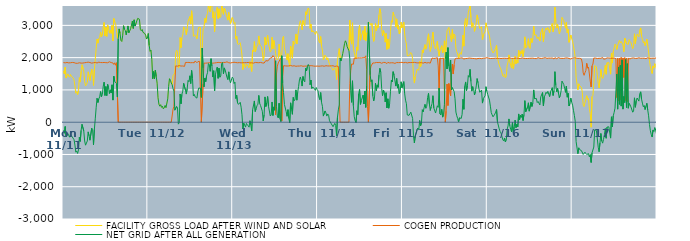
| Category | FACILITY GROSS LOAD AFTER WIND AND SOLAR | COGEN PRODUCTION | NET GRID AFTER ALL GENERATION |
|---|---|---|---|
|  Mon  11/11 | 1593 | 1847 | -254 |
|  Mon  11/11 | 1495 | 1838 | -343 |
|  Mon  11/11 | 1705 | 1839 | -134 |
|  Mon  11/11 | 1369 | 1828 | -459 |
|  Mon  11/11 | 1440 | 1850 | -410 |
|  Mon  11/11 | 1496 | 1850 | -354 |
|  Mon  11/11 | 1423 | 1838 | -415 |
|  Mon  11/11 | 1392 | 1857 | -465 |
|  Mon  11/11 | 1478 | 1842 | -364 |
|  Mon  11/11 | 1421 | 1844 | -423 |
|  Mon  11/11 | 1393 | 1851 | -458 |
|  Mon  11/11 | 1372 | 1834 | -462 |
|  Mon  11/11 | 1301 | 1845 | -544 |
|  Mon  11/11 | 1128 | 1837 | -709 |
|  Mon  11/11 | 897 | 1826 | -929 |
|  Mon  11/11 | 948 | 1839 | -891 |
|  Mon  11/11 | 856 | 1825 | -969 |
|  Mon  11/11 | 979 | 1838 | -859 |
|  Mon  11/11 | 1381 | 1841 | -460 |
|  Mon  11/11 | 1243 | 1839 | -596 |
|  Mon  11/11 | 1578 | 1830 | -252 |
|  Mon  11/11 | 1780 | 1845 | -65 |
|  Mon  11/11 | 1782 | 1832 | -50 |
|  Mon  11/11 | 1585 | 1858 | -273 |
|  Mon  11/11 | 1260 | 1843 | -583 |
|  Mon  11/11 | 1125 | 1838 | -713 |
|  Mon  11/11 | 1161 | 1850 | -689 |
|  Mon  11/11 | 1241 | 1824 | -583 |
|  Mon  11/11 | 1560 | 1860 | -300 |
|  Mon  11/11 | 1417 | 1842 | -425 |
|  Mon  11/11 | 1290 | 1848 | -558 |
|  Mon  11/11 | 1295 | 1827 | -532 |
|  Mon  11/11 | 1643 | 1829 | -186 |
|  Mon  11/11 | 1608 | 1841 | -233 |
|  Mon  11/11 | 1139 | 1842 | -703 |
|  Mon  11/11 | 1617 | 1836 | -219 |
|  Mon  11/11 | 1953 | 1850 | 103 |
|  Mon  11/11 | 2284 | 1838 | 446 |
|  Mon  11/11 | 2576 | 1835 | 741 |
|  Mon  11/11 | 2449 | 1839 | 610 |
|  Mon  11/11 | 2586 | 1859 | 727 |
|  Mon  11/11 | 2620 | 1836 | 784 |
|  Mon  11/11 | 2797 | 1848 | 949 |
|  Mon  11/11 | 2644 | 1857 | 787 |
|  Mon  11/11 | 2698 | 1846 | 852 |
|  Mon  11/11 | 2960 | 1848 | 1112 |
|  Mon  11/11 | 3089 | 1850 | 1239 |
|  Mon  11/11 | 2671 | 1844 | 827 |
|  Mon  11/11 | 2949 | 1844 | 1105 |
|  Mon  11/11 | 2656 | 1833 | 823 |
|  Mon  11/11 | 3014 | 1842 | 1172 |
|  Mon  11/11 | 2923 | 1855 | 1068 |
|  Mon  11/11 | 2759 | 1871 | 888 |
|  Mon  11/11 | 2853 | 1849 | 1004 |
|  Mon  11/11 | 2750 | 1847 | 903 |
|  Mon  11/11 | 2998 | 1839 | 1159 |
|  Mon  11/11 | 2519 | 1835 | 684 |
|  Mon  11/11 | 3213 | 1789 | 1424 |
|  Mon  11/11 | 3104 | 1841 | 1263 |
|  Mon  11/11 | 3055 | 1765 | 1290 |
|  Mon  11/11 | 3043 | 1843 | 1200 |
|  Mon  11/11 | 2598 | 1819 | 779 |
|  Mon  11/11 | 2587 | 0 | 2587 |
|  Mon  11/11 | 2890 | 0 | 2890 |
|  Mon  11/11 | 2752 | 0 | 2752 |
|  Mon  11/11 | 2536 | 0 | 2536 |
|  Mon  11/11 | 2501 | 0 | 2501 |
|  Mon  11/11 | 2674 | 0 | 2674 |
|  Mon  11/11 | 2988 | 0 | 2988 |
|  Mon  11/11 | 2880 | 0 | 2880 |
|  Mon  11/11 | 2840 | 0 | 2840 |
|  Mon  11/11 | 2708 | 0 | 2708 |
|  Mon  11/11 | 2832 | 0 | 2832 |
|  Mon  11/11 | 2982 | 0 | 2982 |
|  Mon  11/11 | 2768 | 0 | 2768 |
|  Mon  11/11 | 2793 | 0 | 2793 |
|  Mon  11/11 | 2895 | 0 | 2895 |
|  Mon  11/11 | 2891 | 0 | 2891 |
|  Mon  11/11 | 3133 | 0 | 3133 |
|  Mon  11/11 | 2905 | 0 | 2905 |
|  Mon  11/11 | 3172 | 0 | 3172 |
|  Mon  11/11 | 2978 | 0 | 2978 |
|  Mon  11/11 | 3051 | 0 | 3051 |
|  Mon  11/11 | 3139 | 0 | 3139 |
|  Mon  11/11 | 3216 | 0 | 3216 |
|  Mon  11/11 | 3207 | 0 | 3207 |
|  Mon  11/11 | 3188 | 0 | 3188 |
|  Mon  11/11 | 2874 | 0 | 2874 |
|  Mon  11/11 | 2835 | 0 | 2835 |
|  Mon  11/11 | 2871 | 0 | 2871 |
|  Mon  11/11 | 2784 | 0 | 2784 |
|  Mon  11/11 | 2808 | 0 | 2808 |
|  Mon  11/11 | 2749 | 0 | 2749 |
|  Mon  11/11 | 2696 | 0 | 2696 |
|  Mon  11/11 | 2576 | 0 | 2576 |
|  Mon  11/11 | 2610 | 0 | 2610 |
|  Tue  11/12 | 2747 | 0 | 2747 |
|  Tue  11/12 | 2378 | 0 | 2378 |
|  Tue  11/12 | 2195 | 0 | 2195 |
|  Tue  11/12 | 2233 | 0 | 2233 |
|  Tue  11/12 | 1935 | 0 | 1935 |
|  Tue  11/12 | 1345 | 0 | 1345 |
|  Tue  11/12 | 1569 | 0 | 1569 |
|  Tue  11/12 | 1343 | 0 | 1343 |
|  Tue  11/12 | 1611 | 0 | 1611 |
|  Tue  11/12 | 1409 | 0 | 1409 |
|  Tue  11/12 | 1208 | 0 | 1208 |
|  Tue  11/12 | 758 | 0 | 758 |
|  Tue  11/12 | 558 | 0 | 558 |
|  Tue  11/12 | 496 | 0 | 496 |
|  Tue  11/12 | 542 | 0 | 542 |
|  Tue  11/12 | 460 | 0 | 460 |
|  Tue  11/12 | 493 | 0 | 493 |
|  Tue  11/12 | 413 | 0 | 413 |
|  Tue  11/12 | 444 | 0 | 444 |
|  Tue  11/12 | 518 | 0 | 518 |
|  Tue  11/12 | 450 | 0 | 450 |
|  Tue  11/12 | 422 | 0 | 422 |
|  Tue  11/12 | 722 | 0 | 722 |
|  Tue  11/12 | 1112 | 0 | 1112 |
|  Tue  11/12 | 1348 | 0 | 1348 |
|  Tue  11/12 | 1299 | 0 | 1299 |
|  Tue  11/12 | 1214 | 0 | 1214 |
|  Tue  11/12 | 1162 | 0 | 1162 |
|  Tue  11/12 | 1440 | 404 | 1036 |
|  Tue  11/12 | 1455 | 490 | 965 |
|  Tue  11/12 | 1524 | 1152 | 372 |
|  Tue  11/12 | 2144 | 1744 | 400 |
|  Tue  11/12 | 2232 | 1747 | 485 |
|  Tue  11/12 | 2190 | 1736 | 454 |
|  Tue  11/12 | 1677 | 1738 | -61 |
|  Tue  11/12 | 1737 | 1753 | -16 |
|  Tue  11/12 | 2622 | 1749 | 873 |
|  Tue  11/12 | 2309 | 1739 | 570 |
|  Tue  11/12 | 2609 | 1747 | 862 |
|  Tue  11/12 | 2702 | 1741 | 961 |
|  Tue  11/12 | 2955 | 1750 | 1205 |
|  Tue  11/12 | 2919 | 1730 | 1189 |
|  Tue  11/12 | 2846 | 1851 | 995 |
|  Tue  11/12 | 2706 | 1835 | 871 |
|  Tue  11/12 | 2895 | 1851 | 1044 |
|  Tue  11/12 | 3129 | 1835 | 1294 |
|  Tue  11/12 | 3102 | 1851 | 1251 |
|  Tue  11/12 | 3273 | 1836 | 1437 |
|  Tue  11/12 | 3040 | 1842 | 1198 |
|  Tue  11/12 | 3452 | 1850 | 1602 |
|  Tue  11/12 | 3202 | 1845 | 1357 |
|  Tue  11/12 | 2659 | 1845 | 814 |
|  Tue  11/12 | 2704 | 1843 | 861 |
|  Tue  11/12 | 2683 | 1897 | 786 |
|  Tue  11/12 | 2657 | 1890 | 767 |
|  Tue  11/12 | 2587 | 1842 | 745 |
|  Tue  11/12 | 2813 | 1875 | 938 |
|  Tue  11/12 | 2941 | 1885 | 1056 |
|  Tue  11/12 | 2941 | 1885 | 1056 |
|  Tue  11/12 | 2941 | 1885 | 1056 |
|  Tue  11/12 | 766 | 0 | 766 |
|  Tue  11/12 | 2298 | 0 | 2298 |
|  Tue  11/12 | 2877 | 1194 | 1683 |
|  Tue  11/12 | 2923 | 1829 | 1094 |
|  Tue  11/12 | 3219 | 1855 | 1364 |
|  Tue  11/12 | 3087 | 1829 | 1258 |
|  Tue  11/12 | 3298 | 1847 | 1451 |
|  Tue  11/12 | 3370 | 1835 | 1535 |
|  Tue  11/12 | 3640 | 1823 | 1817 |
|  Tue  11/12 | 3627 | 1842 | 1785 |
|  Tue  11/12 | 3416 | 1839 | 1577 |
|  Tue  11/12 | 3810 | 1843 | 1967 |
|  Tue  11/12 | 3594 | 1857 | 1737 |
|  Tue  11/12 | 3227 | 1828 | 1399 |
|  Tue  11/12 | 3421 | 1826 | 1595 |
|  Tue  11/12 | 2807 | 1835 | 972 |
|  Tue  11/12 | 3324 | 1843 | 1481 |
|  Tue  11/12 | 3464 | 1843 | 1621 |
|  Tue  11/12 | 3561 | 1857 | 1704 |
|  Tue  11/12 | 3210 | 1852 | 1358 |
|  Tue  11/12 | 3515 | 1841 | 1674 |
|  Tue  11/12 | 3240 | 1847 | 1393 |
|  Tue  11/12 | 3271 | 1832 | 1439 |
|  Tue  11/12 | 3661 | 1846 | 1815 |
|  Tue  11/12 | 3679 | 1832 | 1847 |
|  Tue  11/12 | 3344 | 1851 | 1493 |
|  Tue  11/12 | 3537 | 1854 | 1683 |
|  Tue  11/12 | 3466 | 1851 | 1615 |
|  Tue  11/12 | 3495 | 1852 | 1643 |
|  Tue  11/12 | 3260 | 1870 | 1390 |
|  Tue  11/12 | 3162 | 1841 | 1321 |
|  Tue  11/12 | 3402 | 1843 | 1559 |
|  Tue  11/12 | 3175 | 1858 | 1317 |
|  Tue  11/12 | 3054 | 1834 | 1220 |
|  Tue  11/12 | 3061 | 1842 | 1219 |
|  Tue  11/12 | 3244 | 1848 | 1396 |
|  Wed  11/13 | 3191 | 1832 | 1359 |
|  Wed  11/13 | 3055 | 1858 | 1197 |
|  Wed  11/13 | 3090 | 1849 | 1241 |
|  Wed  11/13 | 2581 | 1848 | 733 |
|  Wed  11/13 | 2663 | 1830 | 833 |
|  Wed  11/13 | 2436 | 1841 | 595 |
|  Wed  11/13 | 2401 | 1849 | 552 |
|  Wed  11/13 | 2385 | 1846 | 539 |
|  Wed  11/13 | 2462 | 1846 | 616 |
|  Wed  11/13 | 2304 | 1839 | 465 |
|  Wed  11/13 | 2074 | 1845 | 229 |
|  Wed  11/13 | 1632 | 1843 | -211 |
|  Wed  11/13 | 1815 | 1842 | -27 |
|  Wed  11/13 | 1801 | 1844 | -43 |
|  Wed  11/13 | 1693 | 1846 | -153 |
|  Wed  11/13 | 1805 | 1844 | -39 |
|  Wed  11/13 | 1770 | 1847 | -77 |
|  Wed  11/13 | 1738 | 1852 | -114 |
|  Wed  11/13 | 1687 | 1842 | -155 |
|  Wed  11/13 | 1881 | 1836 | 45 |
|  Wed  11/13 | 1741 | 1827 | -86 |
|  Wed  11/13 | 1569 | 1840 | -271 |
|  Wed  11/13 | 2228 | 1846 | 382 |
|  Wed  11/13 | 2191 | 1829 | 362 |
|  Wed  11/13 | 2496 | 1838 | 658 |
|  Wed  11/13 | 2182 | 1851 | 331 |
|  Wed  11/13 | 2267 | 1843 | 424 |
|  Wed  11/13 | 2357 | 1845 | 512 |
|  Wed  11/13 | 2418 | 1860 | 558 |
|  Wed  11/13 | 2672 | 1843 | 829 |
|  Wed  11/13 | 2419 | 1841 | 578 |
|  Wed  11/13 | 2368 | 1851 | 517 |
|  Wed  11/13 | 2337 | 1846 | 491 |
|  Wed  11/13 | 2176 | 1837 | 339 |
|  Wed  11/13 | 1898 | 1859 | 39 |
|  Wed  11/13 | 2060 | 1831 | 229 |
|  Wed  11/13 | 2632 | 1849 | 783 |
|  Wed  11/13 | 2392 | 1908 | 484 |
|  Wed  11/13 | 2499 | 1894 | 605 |
|  Wed  11/13 | 2690 | 1894 | 796 |
|  Wed  11/13 | 2422 | 1931 | 491 |
|  Wed  11/13 | 2449 | 1945 | 504 |
|  Wed  11/13 | 2173 | 1982 | 191 |
|  Wed  11/13 | 2221 | 1994 | 227 |
|  Wed  11/13 | 2632 | 2006 | 626 |
|  Wed  11/13 | 2270 | 2062 | 208 |
|  Wed  11/13 | 2533 | 2059 | 474 |
|  Wed  11/13 | 2371 | 2001 | 370 |
|  Wed  11/13 | 2131 | 230 | 1901 |
|  Wed  11/13 | 1977 | 1492 | 485 |
|  Wed  11/13 | 1929 | 1735 | 194 |
|  Wed  11/13 | 1970 | 1836 | 134 |
|  Wed  11/13 | 2415 | 1828 | 587 |
|  Wed  11/13 | 2047 | 1939 | 108 |
|  Wed  11/13 | 2004 | 1985 | 19 |
|  Wed  11/13 | 2093 | 35 | 2058 |
|  Wed  11/13 | 2607 | 1397 | 1210 |
|  Wed  11/13 | 2664 | 1750 | 914 |
|  Wed  11/13 | 2306 | 1759 | 547 |
|  Wed  11/13 | 2308 | 1745 | 563 |
|  Wed  11/13 | 2070 | 1745 | 325 |
|  Wed  11/13 | 1923 | 1740 | 183 |
|  Wed  11/13 | 2122 | 1734 | 388 |
|  Wed  11/13 | 1857 | 1744 | 113 |
|  Wed  11/13 | 1727 | 1747 | -20 |
|  Wed  11/13 | 2357 | 1758 | 599 |
|  Wed  11/13 | 2151 | 1747 | 404 |
|  Wed  11/13 | 1983 | 1739 | 244 |
|  Wed  11/13 | 2506 | 1740 | 766 |
|  Wed  11/13 | 2414 | 1748 | 666 |
|  Wed  11/13 | 2453 | 1752 | 701 |
|  Wed  11/13 | 2733 | 1732 | 1001 |
|  Wed  11/13 | 2426 | 1744 | 682 |
|  Wed  11/13 | 2665 | 1739 | 926 |
|  Wed  11/13 | 2842 | 1741 | 1101 |
|  Wed  11/13 | 3048 | 1739 | 1309 |
|  Wed  11/13 | 3146 | 1747 | 1399 |
|  Wed  11/13 | 3046 | 1748 | 1298 |
|  Wed  11/13 | 2865 | 1746 | 1119 |
|  Wed  11/13 | 3147 | 1732 | 1415 |
|  Wed  11/13 | 3038 | 1743 | 1295 |
|  Wed  11/13 | 2988 | 1738 | 1250 |
|  Wed  11/13 | 3420 | 1750 | 1670 |
|  Wed  11/13 | 3327 | 1738 | 1589 |
|  Wed  11/13 | 3477 | 1751 | 1726 |
|  Wed  11/13 | 3539 | 1751 | 1788 |
|  Wed  11/13 | 3470 | 1752 | 1718 |
|  Wed  11/13 | 2910 | 1750 | 1160 |
|  Wed  11/13 | 3038 | 1731 | 1307 |
|  Wed  11/13 | 2795 | 1750 | 1045 |
|  Wed  11/13 | 2837 | 1747 | 1090 |
|  Wed  11/13 | 2835 | 1739 | 1096 |
|  Wed  11/13 | 2773 | 1740 | 1033 |
|  Wed  11/13 | 2718 | 1734 | 984 |
|  Wed  11/13 | 2817 | 1742 | 1075 |
|  Wed  11/13 | 2752 | 1739 | 1013 |
|  Thu  11/14 | 2710 | 1741 | 969 |
|  Thu  11/14 | 2510 | 1734 | 776 |
|  Thu  11/14 | 2457 | 1759 | 698 |
|  Thu  11/14 | 2655 | 1739 | 916 |
|  Thu  11/14 | 2345 | 1733 | 612 |
|  Thu  11/14 | 2236 | 1745 | 491 |
|  Thu  11/14 | 1934 | 1745 | 189 |
|  Thu  11/14 | 1927 | 1733 | 194 |
|  Thu  11/14 | 2075 | 1727 | 348 |
|  Thu  11/14 | 2033 | 1749 | 284 |
|  Thu  11/14 | 1929 | 1740 | 189 |
|  Thu  11/14 | 1997 | 1742 | 255 |
|  Thu  11/14 | 1971 | 1756 | 215 |
|  Thu  11/14 | 1784 | 1742 | 42 |
|  Thu  11/14 | 1758 | 1742 | 16 |
|  Thu  11/14 | 1699 | 1746 | -47 |
|  Thu  11/14 | 1705 | 1734 | -29 |
|  Thu  11/14 | 1608 | 1748 | -140 |
|  Thu  11/14 | 1580 | 1745 | -165 |
|  Thu  11/14 | 1692 | 1728 | -36 |
|  Thu  11/14 | 1630 | 1731 | -101 |
|  Thu  11/14 | 1323 | 1739 | -416 |
|  Thu  11/14 | 1902 | 1750 | 152 |
|  Thu  11/14 | 2108 | 1727 | 381 |
|  Thu  11/14 | 2280 | 1748 | 532 |
|  Thu  11/14 | 1988 | 0 | 1988 |
|  Thu  11/14 | 1895 | 0 | 1895 |
|  Thu  11/14 | 1999 | 0 | 1999 |
|  Thu  11/14 | 2127 | 0 | 2127 |
|  Thu  11/14 | 2270 | 0 | 2270 |
|  Thu  11/14 | 2432 | 0 | 2432 |
|  Thu  11/14 | 2521 | 0 | 2521 |
|  Thu  11/14 | 2466 | 0 | 2466 |
|  Thu  11/14 | 2340 | 0 | 2340 |
|  Thu  11/14 | 2323 | 0 | 2323 |
|  Thu  11/14 | 2211 | 0 | 2211 |
|  Thu  11/14 | 3161 | 1200 | 1961 |
|  Thu  11/14 | 2563 | 1593 | 970 |
|  Thu  11/14 | 2418 | 1803 | 615 |
|  Thu  11/14 | 3079 | 1797 | 1282 |
|  Thu  11/14 | 2306 | 1795 | 511 |
|  Thu  11/14 | 2156 | 1989 | 167 |
|  Thu  11/14 | 2038 | 1992 | 46 |
|  Thu  11/14 | 1967 | 1979 | -12 |
|  Thu  11/14 | 2331 | 1977 | 354 |
|  Thu  11/14 | 2229 | 1992 | 237 |
|  Thu  11/14 | 2846 | 1972 | 874 |
|  Thu  11/14 | 3007 | 1992 | 1015 |
|  Thu  11/14 | 2539 | 1988 | 551 |
|  Thu  11/14 | 2660 | 1991 | 669 |
|  Thu  11/14 | 2641 | 1976 | 665 |
|  Thu  11/14 | 2838 | 1998 | 840 |
|  Thu  11/14 | 2549 | 1986 | 563 |
|  Thu  11/14 | 2971 | 2005 | 966 |
|  Thu  11/14 | 2514 | 2056 | 458 |
|  Thu  11/14 | 2769 | 1634 | 1135 |
|  Thu  11/14 | 2727 | 490 | 2237 |
|  Thu  11/14 | 3096 | 0 | 3096 |
|  Thu  11/14 | 3091 | 23 | 3068 |
|  Thu  11/14 | 3066 | 1599 | 1467 |
|  Thu  11/14 | 2995 | 1741 | 1254 |
|  Thu  11/14 | 3061 | 1748 | 1313 |
|  Thu  11/14 | 2650 | 1835 | 815 |
|  Thu  11/14 | 2504 | 1845 | 659 |
|  Thu  11/14 | 2641 | 1836 | 805 |
|  Thu  11/14 | 3057 | 1850 | 1207 |
|  Thu  11/14 | 2827 | 1850 | 977 |
|  Thu  11/14 | 2995 | 1840 | 1155 |
|  Thu  11/14 | 2929 | 1847 | 1082 |
|  Thu  11/14 | 3321 | 1861 | 1460 |
|  Thu  11/14 | 3519 | 1851 | 1668 |
|  Thu  11/14 | 3392 | 1848 | 1544 |
|  Thu  11/14 | 2874 | 1826 | 1048 |
|  Thu  11/14 | 2672 | 1851 | 821 |
|  Thu  11/14 | 2848 | 1851 | 997 |
|  Thu  11/14 | 2747 | 1831 | 916 |
|  Thu  11/14 | 2478 | 1850 | 628 |
|  Thu  11/14 | 2748 | 1836 | 912 |
|  Thu  11/14 | 2256 | 1816 | 440 |
|  Thu  11/14 | 2578 | 1853 | 725 |
|  Thu  11/14 | 2286 | 1853 | 433 |
|  Thu  11/14 | 2415 | 1835 | 580 |
|  Thu  11/14 | 2814 | 1857 | 957 |
|  Thu  11/14 | 3147 | 1841 | 1306 |
|  Thu  11/14 | 3094 | 1847 | 1247 |
|  Thu  11/14 | 3405 | 1840 | 1565 |
|  Thu  11/14 | 3305 | 1843 | 1462 |
|  Thu  11/14 | 3268 | 1822 | 1446 |
|  Thu  11/14 | 2952 | 1833 | 1119 |
|  Thu  11/14 | 3202 | 1847 | 1355 |
|  Thu  11/14 | 2887 | 1831 | 1056 |
|  Thu  11/14 | 3012 | 1846 | 1166 |
|  Thu  11/14 | 2732 | 1845 | 887 |
|  Thu  11/14 | 2797 | 1847 | 950 |
|  Thu  11/14 | 3102 | 1850 | 1252 |
|  Thu  11/14 | 2922 | 1855 | 1067 |
|  Fri  11/15 | 2935 | 1848 | 1087 |
|  Fri  11/15 | 3096 | 1842 | 1254 |
|  Fri  11/15 | 2741 | 1850 | 891 |
|  Fri  11/15 | 2534 | 1851 | 683 |
|  Fri  11/15 | 2426 | 1854 | 572 |
|  Fri  11/15 | 2059 | 1836 | 223 |
|  Fri  11/15 | 2072 | 1840 | 232 |
|  Fri  11/15 | 2061 | 1848 | 213 |
|  Fri  11/15 | 2058 | 1855 | 203 |
|  Fri  11/15 | 2158 | 1846 | 312 |
|  Fri  11/15 | 2124 | 1829 | 295 |
|  Fri  11/15 | 1966 | 1849 | 117 |
|  Fri  11/15 | 1422 | 1845 | -423 |
|  Fri  11/15 | 1212 | 1854 | -642 |
|  Fri  11/15 | 1410 | 1843 | -433 |
|  Fri  11/15 | 1506 | 1842 | -336 |
|  Fri  11/15 | 1634 | 1858 | -224 |
|  Fri  11/15 | 1657 | 1837 | -180 |
|  Fri  11/15 | 1614 | 1846 | -232 |
|  Fri  11/15 | 1895 | 1841 | 54 |
|  Fri  11/15 | 1719 | 1836 | -117 |
|  Fri  11/15 | 1818 | 1844 | -26 |
|  Fri  11/15 | 2231 | 1845 | 386 |
|  Fri  11/15 | 2150 | 1830 | 320 |
|  Fri  11/15 | 2295 | 1848 | 447 |
|  Fri  11/15 | 2404 | 1852 | 552 |
|  Fri  11/15 | 2264 | 1832 | 432 |
|  Fri  11/15 | 2328 | 1834 | 494 |
|  Fri  11/15 | 2609 | 1842 | 767 |
|  Fri  11/15 | 2739 | 1845 | 894 |
|  Fri  11/15 | 2405 | 1840 | 565 |
|  Fri  11/15 | 2194 | 1830 | 364 |
|  Fri  11/15 | 2328 | 1848 | 480 |
|  Fri  11/15 | 2564 | 1987 | 577 |
|  Fri  11/15 | 2791 | 1971 | 820 |
|  Fri  11/15 | 2419 | 1976 | 443 |
|  Fri  11/15 | 2405 | 1973 | 432 |
|  Fri  11/15 | 2266 | 1982 | 284 |
|  Fri  11/15 | 2236 | 1977 | 259 |
|  Fri  11/15 | 2506 | 1998 | 508 |
|  Fri  11/15 | 2203 | 1743 | 460 |
|  Fri  11/15 | 2046 | 990 | 1056 |
|  Fri  11/15 | 2240 | 1984 | 256 |
|  Fri  11/15 | 2222 | 1998 | 224 |
|  Fri  11/15 | 2371 | 1973 | 398 |
|  Fri  11/15 | 2146 | 1989 | 157 |
|  Fri  11/15 | 2227 | 1987 | 240 |
|  Fri  11/15 | 2522 | 1973 | 549 |
|  Fri  11/15 | 1950 | 0 | 1950 |
|  Fri  11/15 | 2513 | 341 | 2172 |
|  Fri  11/15 | 2831 | 1182 | 1649 |
|  Fri  11/15 | 2827 | 516 | 2311 |
|  Fri  11/15 | 2936 | 1198 | 1738 |
|  Fri  11/15 | 2763 | 1190 | 1573 |
|  Fri  11/15 | 2735 | 814 | 1921 |
|  Fri  11/15 | 2485 | 1487 | 998 |
|  Fri  11/15 | 2868 | 1797 | 1071 |
|  Fri  11/15 | 2588 | 1492 | 1096 |
|  Fri  11/15 | 2731 | 1784 | 947 |
|  Fri  11/15 | 2685 | 1959 | 726 |
|  Fri  11/15 | 2285 | 1971 | 314 |
|  Fri  11/15 | 2181 | 1983 | 198 |
|  Fri  11/15 | 2111 | 1999 | 112 |
|  Fri  11/15 | 1979 | 1973 | 6 |
|  Fri  11/15 | 2117 | 1982 | 135 |
|  Fri  11/15 | 2153 | 1988 | 165 |
|  Fri  11/15 | 2099 | 1983 | 116 |
|  Fri  11/15 | 2236 | 1993 | 243 |
|  Fri  11/15 | 2697 | 1985 | 712 |
|  Fri  11/15 | 2356 | 1957 | 399 |
|  Fri  11/15 | 3095 | 1982 | 1113 |
|  Fri  11/15 | 3218 | 1971 | 1247 |
|  Fri  11/15 | 2964 | 1986 | 978 |
|  Fri  11/15 | 3100 | 1976 | 1124 |
|  Fri  11/15 | 3392 | 1947 | 1445 |
|  Fri  11/15 | 3380 | 1987 | 1393 |
|  Fri  11/15 | 3633 | 1996 | 1637 |
|  Fri  11/15 | 3242 | 1981 | 1261 |
|  Fri  11/15 | 2938 | 1976 | 962 |
|  Fri  11/15 | 3079 | 1975 | 1104 |
|  Fri  11/15 | 3023 | 1984 | 1039 |
|  Fri  11/15 | 2814 | 1971 | 843 |
|  Fri  11/15 | 2916 | 1972 | 944 |
|  Fri  11/15 | 3083 | 1960 | 1123 |
|  Fri  11/15 | 3324 | 1973 | 1351 |
|  Fri  11/15 | 3194 | 1973 | 1221 |
|  Fri  11/15 | 3015 | 1973 | 1042 |
|  Fri  11/15 | 2904 | 1977 | 927 |
|  Fri  11/15 | 2898 | 1982 | 916 |
|  Fri  11/15 | 2961 | 1968 | 993 |
|  Fri  11/15 | 2560 | 1969 | 591 |
|  Fri  11/15 | 2712 | 1982 | 730 |
|  Fri  11/15 | 2724 | 1983 | 741 |
|  Fri  11/15 | 2801 | 1985 | 816 |
|  Fri  11/15 | 3079 | 1980 | 1099 |
|  Fri  11/15 | 2954 | 1998 | 956 |
|  Sat  11/16 | 2848 | 1988 | 860 |
|  Sat  11/16 | 2853 | 1985 | 868 |
|  Sat  11/16 | 2665 | 1982 | 683 |
|  Sat  11/16 | 2469 | 1972 | 497 |
|  Sat  11/16 | 2278 | 1979 | 299 |
|  Sat  11/16 | 2201 | 1975 | 226 |
|  Sat  11/16 | 2145 | 1979 | 166 |
|  Sat  11/16 | 2122 | 1977 | 145 |
|  Sat  11/16 | 2234 | 1985 | 249 |
|  Sat  11/16 | 2295 | 1984 | 311 |
|  Sat  11/16 | 2382 | 1988 | 394 |
|  Sat  11/16 | 1984 | 1974 | 10 |
|  Sat  11/16 | 1968 | 1970 | -2 |
|  Sat  11/16 | 1773 | 1980 | -207 |
|  Sat  11/16 | 1697 | 1987 | -290 |
|  Sat  11/16 | 1640 | 1973 | -333 |
|  Sat  11/16 | 1619 | 1974 | -355 |
|  Sat  11/16 | 1438 | 1979 | -541 |
|  Sat  11/16 | 1407 | 1986 | -579 |
|  Sat  11/16 | 1491 | 1981 | -490 |
|  Sat  11/16 | 1373 | 1986 | -613 |
|  Sat  11/16 | 1425 | 1978 | -553 |
|  Sat  11/16 | 1761 | 1977 | -216 |
|  Sat  11/16 | 1863 | 1978 | -115 |
|  Sat  11/16 | 2085 | 1984 | 101 |
|  Sat  11/16 | 1876 | 1991 | -115 |
|  Sat  11/16 | 1750 | 1977 | -227 |
|  Sat  11/16 | 1676 | 1977 | -301 |
|  Sat  11/16 | 1967 | 1981 | -14 |
|  Sat  11/16 | 1657 | 1978 | -321 |
|  Sat  11/16 | 1827 | 1978 | -151 |
|  Sat  11/16 | 2044 | 1980 | 64 |
|  Sat  11/16 | 1807 | 1977 | -170 |
|  Sat  11/16 | 1928 | 1991 | -63 |
|  Sat  11/16 | 1832 | 1979 | -147 |
|  Sat  11/16 | 2227 | 1972 | 255 |
|  Sat  11/16 | 2040 | 1966 | 74 |
|  Sat  11/16 | 2191 | 1975 | 216 |
|  Sat  11/16 | 2118 | 1972 | 146 |
|  Sat  11/16 | 2244 | 1992 | 252 |
|  Sat  11/16 | 2033 | 1982 | 51 |
|  Sat  11/16 | 2218 | 1979 | 239 |
|  Sat  11/16 | 2645 | 1978 | 667 |
|  Sat  11/16 | 2297 | 1974 | 323 |
|  Sat  11/16 | 2333 | 1985 | 348 |
|  Sat  11/16 | 2441 | 1974 | 467 |
|  Sat  11/16 | 2586 | 1985 | 601 |
|  Sat  11/16 | 2320 | 1978 | 342 |
|  Sat  11/16 | 2280 | 1965 | 315 |
|  Sat  11/16 | 2599 | 1981 | 618 |
|  Sat  11/16 | 2469 | 1982 | 487 |
|  Sat  11/16 | 2574 | 1983 | 591 |
|  Sat  11/16 | 2977 | 1977 | 1000 |
|  Sat  11/16 | 2700 | 1973 | 727 |
|  Sat  11/16 | 2702 | 1990 | 712 |
|  Sat  11/16 | 2705 | 1969 | 736 |
|  Sat  11/16 | 2593 | 1985 | 608 |
|  Sat  11/16 | 2639 | 1999 | 640 |
|  Sat  11/16 | 2657 | 1987 | 670 |
|  Sat  11/16 | 2514 | 1979 | 535 |
|  Sat  11/16 | 2776 | 1992 | 784 |
|  Sat  11/16 | 2780 | 1975 | 805 |
|  Sat  11/16 | 2904 | 1986 | 918 |
|  Sat  11/16 | 2493 | 1986 | 507 |
|  Sat  11/16 | 2765 | 1982 | 783 |
|  Sat  11/16 | 2844 | 1999 | 845 |
|  Sat  11/16 | 2917 | 1990 | 927 |
|  Sat  11/16 | 2863 | 1978 | 885 |
|  Sat  11/16 | 2934 | 1978 | 956 |
|  Sat  11/16 | 2928 | 1985 | 943 |
|  Sat  11/16 | 2768 | 1975 | 793 |
|  Sat  11/16 | 2920 | 1984 | 936 |
|  Sat  11/16 | 2943 | 1979 | 964 |
|  Sat  11/16 | 3057 | 1988 | 1069 |
|  Sat  11/16 | 2797 | 1969 | 828 |
|  Sat  11/16 | 2935 | 1958 | 977 |
|  Sat  11/16 | 3564 | 1999 | 1565 |
|  Sat  11/16 | 3114 | 1974 | 1140 |
|  Sat  11/16 | 2912 | 1968 | 944 |
|  Sat  11/16 | 3031 | 1976 | 1055 |
|  Sat  11/16 | 2906 | 2002 | 904 |
|  Sat  11/16 | 2740 | 1988 | 752 |
|  Sat  11/16 | 2808 | 1978 | 830 |
|  Sat  11/16 | 2957 | 1985 | 972 |
|  Sat  11/16 | 3251 | 1977 | 1274 |
|  Sat  11/16 | 3249 | 1972 | 1277 |
|  Sat  11/16 | 3144 | 1975 | 1169 |
|  Sat  11/16 | 3034 | 1982 | 1052 |
|  Sat  11/16 | 2914 | 1989 | 925 |
|  Sat  11/16 | 3091 | 1974 | 1117 |
|  Sat  11/16 | 2764 | 1990 | 774 |
|  Sat  11/16 | 2876 | 1982 | 894 |
|  Sat  11/16 | 2475 | 1974 | 501 |
|  Sat  11/16 | 2562 | 1988 | 574 |
|  Sat  11/16 | 2702 | 1956 | 746 |
|  Sat  11/16 | 2591 | 1974 | 617 |
|  Sun  11/17 | 2515 | 1986 | 529 |
|  Sun  11/17 | 2355 | 1986 | 369 |
|  Sun  11/17 | 2207 | 1996 | 211 |
|  Sun  11/17 | 2002 | 1972 | 30 |
|  Sun  11/17 | 1384 | 1987 | -603 |
|  Sun  11/17 | 1375 | 1971 | -596 |
|  Sun  11/17 | 1001 | 1977 | -976 |
|  Sun  11/17 | 1189 | 1983 | -794 |
|  Sun  11/17 | 1127 | 1978 | -851 |
|  Sun  11/17 | 1121 | 1988 | -867 |
|  Sun  11/17 | 1079 | 1959 | -880 |
|  Sun  11/17 | 931 | 1831 | -900 |
|  Sun  11/17 | 529 | 1529 | -1000 |
|  Sun  11/17 | 482 | 1452 | -970 |
|  Sun  11/17 | 605 | 1535 | -930 |
|  Sun  11/17 | 629 | 1600 | -971 |
|  Sun  11/17 | 821 | 1823 | -1002 |
|  Sun  11/17 | 700 | 1674 | -974 |
|  Sun  11/17 | 734 | 1708 | -974 |
|  Sun  11/17 | 417 | 1493 | -1076 |
|  Sun  11/17 | 268 | 1271 | -1003 |
|  Sun  11/17 | -157 | 1091 | -1248 |
|  Sun  11/17 | 795 | 1743 | -948 |
|  Sun  11/17 | 828 | 1802 | -974 |
|  Sun  11/17 | 1218 | 1988 | -770 |
|  Sun  11/17 | 1752 | 1988 | -236 |
|  Sun  11/17 | 1768 | 1986 | -218 |
|  Sun  11/17 | 1717 | 1974 | -257 |
|  Sun  11/17 | 1451 | 1972 | -521 |
|  Sun  11/17 | 1210 | 1984 | -774 |
|  Sun  11/17 | 1062 | 1979 | -917 |
|  Sun  11/17 | 1345 | 1982 | -637 |
|  Sun  11/17 | 1630 | 1979 | -349 |
|  Sun  11/17 | 1407 | 1991 | -584 |
|  Sun  11/17 | 1354 | 2004 | -650 |
|  Sun  11/17 | 1418 | 1954 | -536 |
|  Sun  11/17 | 1587 | 1974 | -387 |
|  Sun  11/17 | 1763 | 1960 | -197 |
|  Sun  11/17 | 1485 | 1982 | -497 |
|  Sun  11/17 | 1840 | 1992 | -152 |
|  Sun  11/17 | 1814 | 1988 | -174 |
|  Sun  11/17 | 1845 | 1988 | -143 |
|  Sun  11/17 | 1826 | 1989 | -163 |
|  Sun  11/17 | 1488 | 1982 | -494 |
|  Sun  11/17 | 2139 | 1973 | 166 |
|  Sun  11/17 | 1832 | 1978 | -146 |
|  Sun  11/17 | 2183 | 1989 | 194 |
|  Sun  11/17 | 2291 | 1988 | 303 |
|  Sun  11/17 | 2419 | 1985 | 434 |
|  Sun  11/17 | 2388 | 1969 | 419 |
|  Sun  11/17 | 2255 | 764 | 1491 |
|  Sun  11/17 | 2382 | 1978 | 404 |
|  Sun  11/17 | 2373 | 663 | 1710 |
|  Sun  11/17 | 2537 | 1984 | 553 |
|  Sun  11/17 | 2453 | 693 | 1760 |
|  Sun  11/17 | 2501 | 2003 | 498 |
|  Sun  11/17 | 2512 | 582 | 1930 |
|  Sun  11/17 | 2395 | 1990 | 405 |
|  Sun  11/17 | 2183 | 1386 | 797 |
|  Sun  11/17 | 2607 | 1998 | 609 |
|  Sun  11/17 | 2611 | 673 | 1938 |
|  Sun  11/17 | 2433 | 1977 | 456 |
|  Sun  11/17 | 2450 | 638 | 1812 |
|  Sun  11/17 | 2411 | 1978 | 433 |
|  Sun  11/17 | 2558 | 1976 | 582 |
|  Sun  11/17 | 2499 | 1960 | 539 |
|  Sun  11/17 | 2463 | 1990 | 473 |
|  Sun  11/17 | 2469 | 1985 | 484 |
|  Sun  11/17 | 2278 | 1969 | 309 |
|  Sun  11/17 | 2338 | 1990 | 348 |
|  Sun  11/17 | 2738 | 1983 | 755 |
|  Sun  11/17 | 2437 | 1975 | 462 |
|  Sun  11/17 | 2637 | 1984 | 653 |
|  Sun  11/17 | 2727 | 1978 | 749 |
|  Sun  11/17 | 2703 | 1971 | 732 |
|  Sun  11/17 | 2647 | 1995 | 652 |
|  Sun  11/17 | 2857 | 1982 | 875 |
|  Sun  11/17 | 2921 | 1980 | 941 |
|  Sun  11/17 | 2674 | 1961 | 713 |
|  Sun  11/17 | 2572 | 1982 | 590 |
|  Sun  11/17 | 2460 | 1982 | 478 |
|  Sun  11/17 | 2499 | 1982 | 517 |
|  Sun  11/17 | 2373 | 1982 | 391 |
|  Sun  11/17 | 2462 | 1969 | 493 |
|  Sun  11/17 | 2574 | 1989 | 585 |
|  Sun  11/17 | 2376 | 1997 | 379 |
|  Sun  11/17 | 2173 | 1975 | 198 |
|  Sun  11/17 | 1906 | 1979 | -73 |
|  Sun  11/17 | 1716 | 1981 | -265 |
|  Sun  11/17 | 1599 | 1980 | -381 |
|  Sun  11/17 | 1508 | 1968 | -460 |
|  Sun  11/17 | 1742 | 1983 | -241 |
|  Sun  11/17 | 1678 | 1970 | -292 |
|  Sun  11/17 | 1816 | 1981 | -165 |
|  Sun  11/17 | 1753 | 1995 | -242 |
|  Sun  11/17 | 1615 | 1993 | -378 |